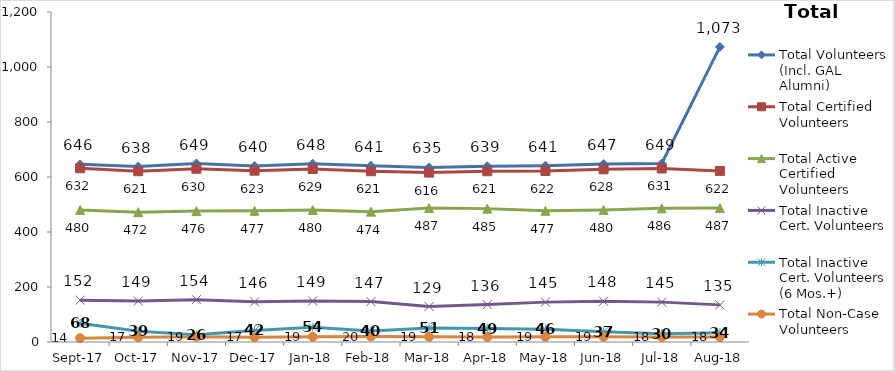
| Category | Total Volunteers (Incl. GAL Alumni) | Total Certified Volunteers | Total Active Certified Volunteers | Total Inactive Cert. Volunteers | Total Inactive Cert. Volunteers (6 Mos.+) | Total Non-Case Volunteers |
|---|---|---|---|---|---|---|
| 2017-09-01 | 646 | 632 | 480 | 152 | 68 | 14 |
| 2017-10-01 | 638 | 621 | 472 | 149 | 39 | 17 |
| 2017-11-01 | 649 | 630 | 476 | 154 | 26 | 19 |
| 2017-12-01 | 640 | 623 | 477 | 146 | 42 | 17 |
| 2018-01-01 | 648 | 629 | 480 | 149 | 54 | 19 |
| 2018-02-01 | 641 | 621 | 474 | 147 | 40 | 20 |
| 2018-03-01 | 635 | 616 | 487 | 129 | 51 | 19 |
| 2018-04-01 | 639 | 621 | 485 | 136 | 49 | 18 |
| 2018-05-01 | 641 | 622 | 477 | 145 | 46 | 19 |
| 2018-06-01 | 647 | 628 | 480 | 148 | 37 | 19 |
| 2018-07-01 | 649 | 631 | 486 | 145 | 30 | 18 |
| 2018-08-01 | 1073 | 622 | 487 | 135 | 34 | 18 |